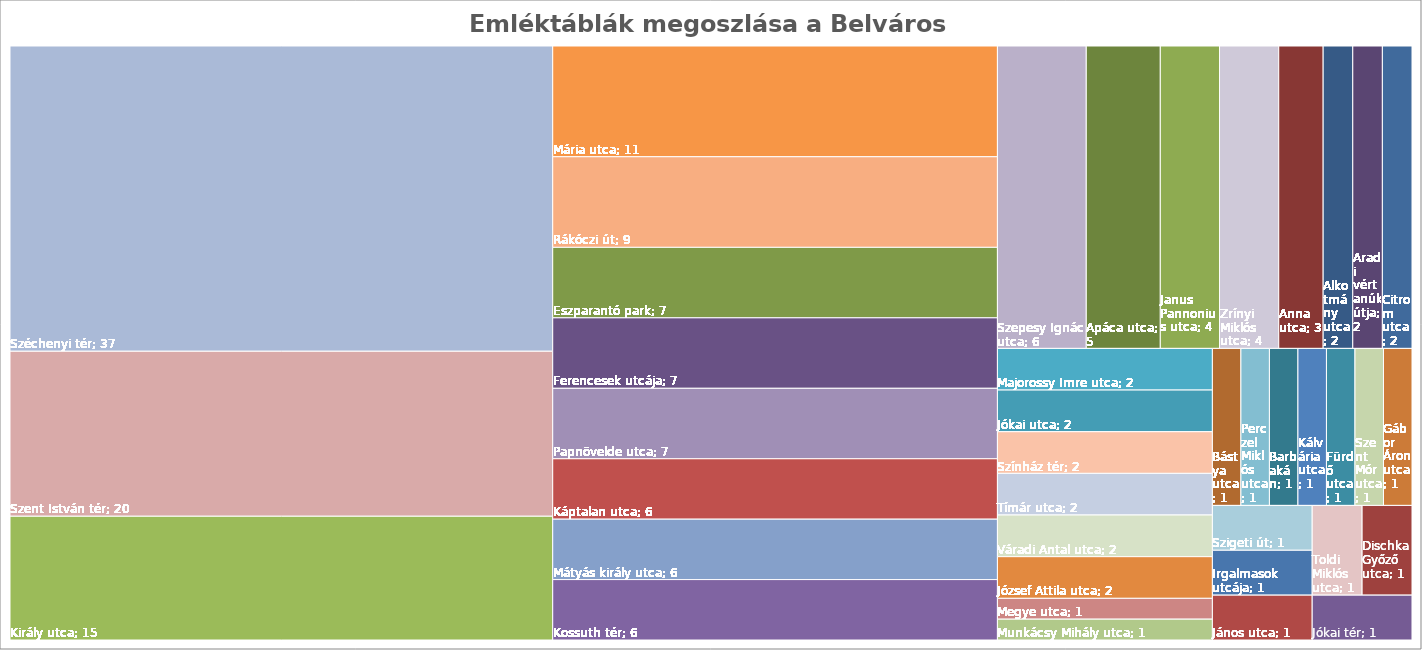
| Category | darab |
|---|---|
| Alkotmány utca | 2 |
| Anna utca | 3 |
| Apáca utca | 5 |
| Aradi vértanúk útja | 2 |
| Barbakán | 1 |
| Bástya utca | 1 |
| Citrom utca | 2 |
| Dischka Győző utca | 1 |
| Eszparantó park | 7 |
| Ferencesek utcája | 7 |
| Fürdő utca | 1 |
| Gábor Áron utca | 1 |
| Irgalmasok utcája | 1 |
| János utca | 1 |
| Janus Pannonius utca | 4 |
| Jókai tér | 1 |
| Jókai utca | 2 |
| József Attila utca | 2 |
| Kálvária utca | 1 |
| Káptalan utca | 6 |
| Király utca | 15 |
| Kossuth tér | 6 |
| Majorossy Imre utca | 2 |
| Mária utca | 11 |
| Mátyás király utca | 6 |
| Megye utca | 1 |
| Munkácsy Mihály utca | 1 |
| Papnövelde utca | 7 |
| Perczel Miklós utca | 1 |
| Rákóczi út | 9 |
| Széchenyi tér | 37 |
| Szent István tér | 20 |
| Szent Mór utca | 1 |
| Szepesy Ignác utca | 6 |
| Szigeti út | 1 |
| Színház tér | 2 |
| Tímár utca | 2 |
| Toldi Miklós utca | 1 |
| Váradi Antal utca | 2 |
| Zrínyi Miklós utca | 4 |